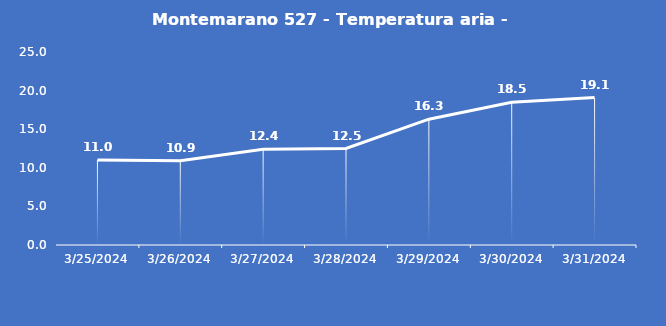
| Category | Montemarano 527 - Temperatura aria - Grezzo (°C) |
|---|---|
| 3/25/24 | 11 |
| 3/26/24 | 10.9 |
| 3/27/24 | 12.4 |
| 3/28/24 | 12.5 |
| 3/29/24 | 16.3 |
| 3/30/24 | 18.5 |
| 3/31/24 | 19.1 |